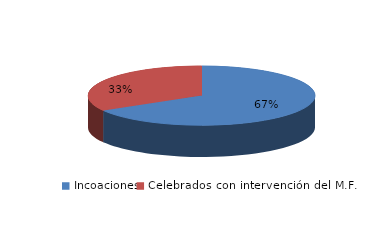
| Category | Series 0 |
|---|---|
| Incoaciones | 2682 |
| Celebrados con intervención del M.F. | 1346 |